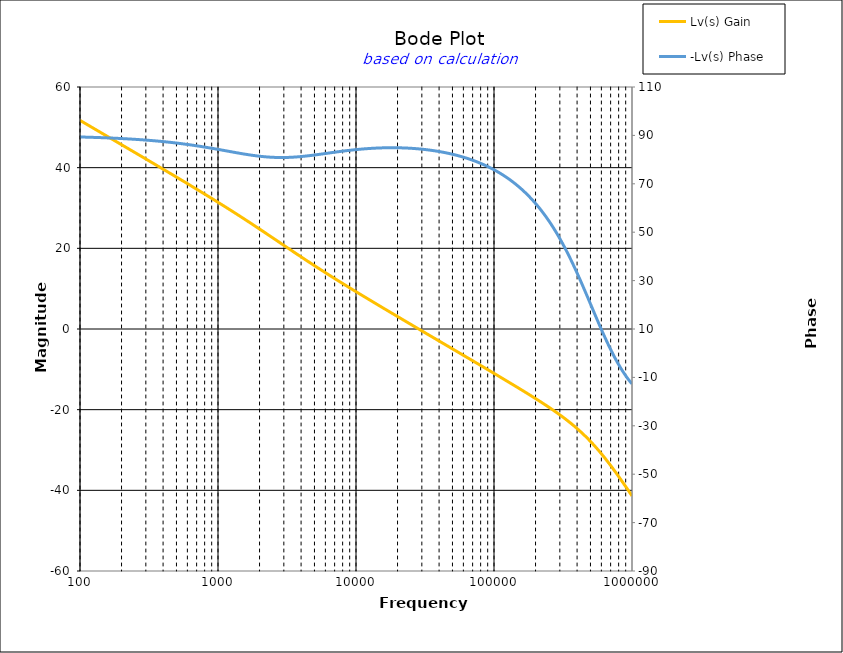
| Category | Lv(s) Gain |
|---|---|
| 100.0 | 51.724 |
| 104.71285480508996 | 51.324 |
| 109.64781961431851 | 50.924 |
| 114.81536214968828 | 50.523 |
| 120.2264434617413 | 50.123 |
| 125.89254117941672 | 49.722 |
| 131.82567385564073 | 49.322 |
| 138.0384264602885 | 48.921 |
| 144.54397707459273 | 48.521 |
| 151.35612484362082 | 48.12 |
| 158.48931924611136 | 47.719 |
| 165.95869074375605 | 47.318 |
| 173.78008287493756 | 46.917 |
| 181.97008586099835 | 46.516 |
| 190.54607179632475 | 46.115 |
| 199.526231496888 | 45.714 |
| 208.92961308540396 | 45.312 |
| 218.77616239495526 | 44.911 |
| 229.08676527677733 | 44.509 |
| 239.8832919019491 | 44.108 |
| 251.18864315095806 | 43.706 |
| 263.0267991895382 | 43.304 |
| 275.4228703338166 | 42.901 |
| 288.4031503126606 | 42.499 |
| 301.9951720402017 | 42.096 |
| 316.22776601683796 | 41.693 |
| 331.13112148259114 | 41.289 |
| 346.7368504525317 | 40.886 |
| 363.0780547701014 | 40.482 |
| 380.1893963205612 | 40.077 |
| 398.10717055349727 | 39.673 |
| 416.8693834703355 | 39.268 |
| 436.515832240166 | 38.862 |
| 457.0881896148751 | 38.456 |
| 478.6300923226384 | 38.049 |
| 501.18723362727235 | 37.641 |
| 524.8074602497726 | 37.233 |
| 549.5408738576245 | 36.825 |
| 575.4399373371572 | 36.415 |
| 602.559586074358 | 36.005 |
| 630.9573444801935 | 35.594 |
| 660.6934480075963 | 35.181 |
| 691.8309709189367 | 34.768 |
| 724.4359600749902 | 34.354 |
| 758.5775750291838 | 33.938 |
| 794.3282347242817 | 33.521 |
| 831.7637711026711 | 33.103 |
| 870.9635899560808 | 32.683 |
| 912.0108393559099 | 32.262 |
| 954.9925860214358 | 31.839 |
| 1000.0 | 31.415 |
| 1047.1285480509 | 30.989 |
| 1096.4781961431854 | 30.56 |
| 1148.1536214968835 | 30.13 |
| 1202.2644346174134 | 29.698 |
| 1258.925411794168 | 29.264 |
| 1318.2567385564075 | 28.828 |
| 1380.3842646028857 | 28.39 |
| 1445.4397707459275 | 27.949 |
| 1513.5612484362086 | 27.507 |
| 1584.8931924611136 | 27.062 |
| 1659.5869074375614 | 26.615 |
| 1737.8008287493756 | 26.167 |
| 1819.7008586099842 | 25.716 |
| 1905.4607179632476 | 25.263 |
| 1995.2623149688804 | 24.809 |
| 2089.29613085404 | 24.353 |
| 2187.7616239495537 | 23.896 |
| 2290.867652767774 | 23.438 |
| 2398.832919019492 | 22.978 |
| 2511.886431509581 | 22.518 |
| 2630.2679918953822 | 22.058 |
| 2754.2287033381667 | 21.597 |
| 2884.0315031266064 | 21.136 |
| 3019.9517204020162 | 20.675 |
| 3162.2776601683804 | 20.215 |
| 3311.311214825913 | 19.756 |
| 3467.368504525318 | 19.297 |
| 3630.7805477010156 | 18.84 |
| 3801.893963205614 | 18.384 |
| 3981.0717055349755 | 17.93 |
| 4168.693834703356 | 17.477 |
| 4365.158322401663 | 17.026 |
| 4570.881896148753 | 16.577 |
| 4786.300923226386 | 16.13 |
| 5011.872336272724 | 15.686 |
| 5248.074602497729 | 15.243 |
| 5495.408738576247 | 14.802 |
| 5754.39937337157 | 14.364 |
| 6025.595860743582 | 13.928 |
| 6309.573444801937 | 13.493 |
| 6606.934480075963 | 13.061 |
| 6918.309709189366 | 12.631 |
| 7244.359600749906 | 12.203 |
| 7585.775750291843 | 11.776 |
| 7943.28234724282 | 11.352 |
| 8317.637711026713 | 10.929 |
| 8709.635899560808 | 10.508 |
| 9120.108393559098 | 10.088 |
| 9549.925860214365 | 9.669 |
| 10000.0 | 9.253 |
| 10471.285480508997 | 8.837 |
| 10964.781961431861 | 8.422 |
| 11481.536214968835 | 8.009 |
| 12022.644346174135 | 7.597 |
| 12589.254117941677 | 7.185 |
| 13182.567385564085 | 6.775 |
| 13803.842646028861 | 6.365 |
| 14454.397707459284 | 5.956 |
| 15135.612484362091 | 5.548 |
| 15848.931924611154 | 5.14 |
| 16595.869074375623 | 4.733 |
| 17378.00828749377 | 4.327 |
| 18197.008586099848 | 3.921 |
| 19054.607179632498 | 3.516 |
| 19952.623149688818 | 3.111 |
| 20892.961308540394 | 2.706 |
| 21877.616239495524 | 2.302 |
| 22908.676527677744 | 1.898 |
| 23988.329190194912 | 1.494 |
| 25118.864315095805 | 1.091 |
| 26302.679918953818 | 0.688 |
| 27542.287033381683 | 0.285 |
| 28840.315031266073 | -0.118 |
| 30199.51720402017 | -0.521 |
| 31622.776601683825 | -0.923 |
| 33113.11214825913 | -1.325 |
| 34673.68504525318 | -1.728 |
| 36307.80547701015 | -2.13 |
| 38018.939632056165 | -2.532 |
| 39810.71705534976 | -2.934 |
| 41686.938347033574 | -3.336 |
| 43651.58322401662 | -3.738 |
| 45708.81896148756 | -4.14 |
| 47863.00923226389 | -4.542 |
| 50118.723362727265 | -4.944 |
| 52480.74602497729 | -5.346 |
| 54954.087385762534 | -5.749 |
| 57543.99373371576 | -6.151 |
| 60255.95860743583 | -6.553 |
| 63095.73444801938 | -6.956 |
| 66069.34480075965 | -7.359 |
| 69183.09709189367 | -7.762 |
| 72443.59600749903 | -8.165 |
| 75857.75750291838 | -8.568 |
| 79432.82347242821 | -8.972 |
| 83176.37711026715 | -9.376 |
| 87096.3589956081 | -9.781 |
| 91201.08393559098 | -10.186 |
| 95499.25860214367 | -10.591 |
| 100000.0 | -10.997 |
| 104712.85480509 | -11.404 |
| 109647.81961431864 | -11.811 |
| 114815.3621496884 | -12.219 |
| 120226.44346174138 | -12.628 |
| 125892.5411794168 | -13.038 |
| 131825.6738556409 | -13.449 |
| 138038.42646028864 | -13.861 |
| 144543.9770745929 | -14.275 |
| 151356.12484362093 | -14.69 |
| 158489.31924611155 | -15.107 |
| 165958.69074375625 | -15.526 |
| 173780.0828749377 | -15.948 |
| 181970.08586099852 | -16.372 |
| 190546.071796325 | -16.799 |
| 199526.2314968882 | -17.229 |
| 208929.6130854042 | -17.664 |
| 218776.1623949553 | -18.103 |
| 229086.7652767775 | -18.547 |
| 239883.29190194918 | -18.997 |
| 251188.64315095812 | -19.453 |
| 263026.79918953823 | -19.916 |
| 275422.8703338169 | -20.388 |
| 288403.1503126608 | -20.87 |
| 301995.1720402018 | -21.362 |
| 316227.766016838 | -21.866 |
| 331131.12148259114 | -22.384 |
| 346736.85045253224 | -22.917 |
| 363078.0547701019 | -23.466 |
| 380189.3963205617 | -24.033 |
| 398107.1705534977 | -24.62 |
| 416869.38347033586 | -25.228 |
| 436515.8322401663 | -25.86 |
| 457088.1896148753 | -26.516 |
| 478630.0923226385 | -27.197 |
| 501187.23362727324 | -27.905 |
| 524807.4602497736 | -28.64 |
| 549540.8738576254 | -29.403 |
| 575439.9373371577 | -30.192 |
| 602559.5860743586 | -31.009 |
| 630957.3444801938 | -31.852 |
| 660693.4480075965 | -32.72 |
| 691830.9709189369 | -33.612 |
| 724435.9600749904 | -34.526 |
| 758577.5750291839 | -35.46 |
| 794328.2347242816 | -36.412 |
| 831763.7711026709 | -37.38 |
| 870963.5899560819 | -38.362 |
| 912010.8393559109 | -39.357 |
| 954992.586021437 | -40.361 |
| 1000000.0 | -41.374 |